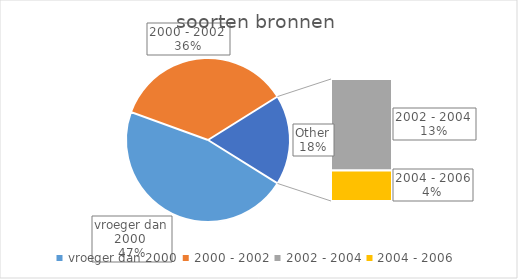
| Category | Series 0 |
|---|---|
| vroeger dan 2000  | 21 |
| 2000 - 2002  | 16 |
| 2002 - 2004  | 6 |
| 2004 - 2006 | 2 |